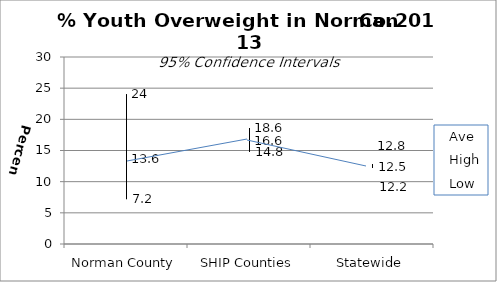
| Category | Ave | High | Low |
|---|---|---|---|
| Norman County | 13.6 | 24 | 7.2 |
| SHIP Counties | 16.6 | 18.6 | 14.8 |
| Statewide | 12.5 | 12.8 | 12.2 |